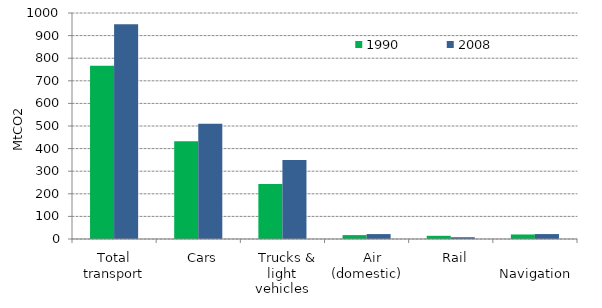
| Category | 1990 | 2008 |
|---|---|---|
| Total transport | 767.044 | 950.728 |
|    Cars | 432.324 | 509.769 |
|    Trucks & light vehicles | 243.551 | 349.148 |
|    Air (domestic) | 17.247 | 21.783 |
|    Rail | 14.113 | 7.767 |
|    Navigation | 20.055 | 21.816 |